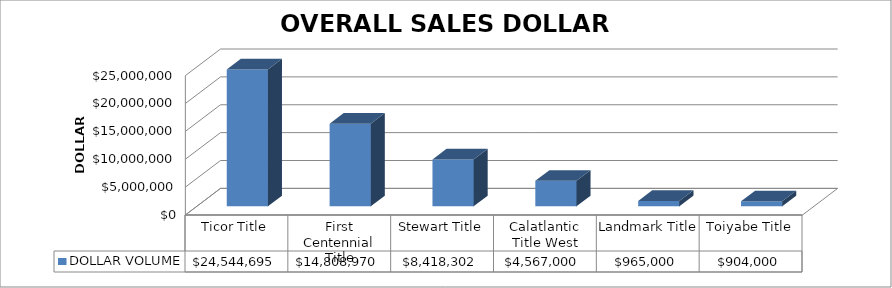
| Category | DOLLAR VOLUME |
|---|---|
| Ticor Title | 24544695 |
| First Centennial Title | 14808970 |
| Stewart Title | 8418302 |
| Calatlantic Title West | 4567000 |
| Landmark Title | 965000 |
| Toiyabe Title | 904000 |